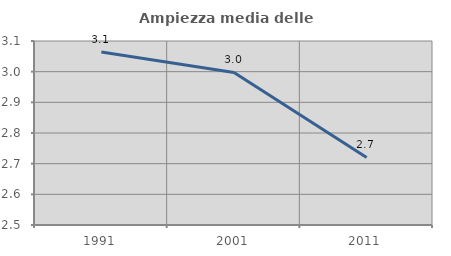
| Category | Ampiezza media delle famiglie |
|---|---|
| 1991.0 | 3.064 |
| 2001.0 | 2.997 |
| 2011.0 | 2.72 |